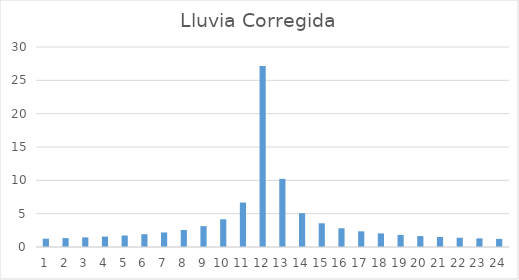
| Category | Lluvia Corregida |
|---|---|
| 0 | 1.251 |
| 1 | 1.338 |
| 2 | 1.441 |
| 3 | 1.565 |
| 4 | 1.72 |
| 5 | 1.917 |
| 6 | 2.181 |
| 7 | 2.553 |
| 8 | 3.128 |
| 9 | 4.159 |
| 10 | 6.667 |
| 11 | 27.145 |
| 12 | 10.226 |
| 13 | 5.075 |
| 14 | 3.557 |
| 15 | 2.806 |
| 16 | 2.349 |
| 17 | 2.039 |
| 18 | 1.812 |
| 19 | 1.638 |
| 20 | 1.5 |
| 21 | 1.387 |
| 22 | 1.293 |
| 23 | 1.213 |